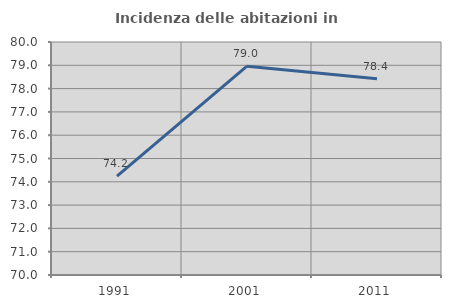
| Category | Incidenza delle abitazioni in proprietà  |
|---|---|
| 1991.0 | 74.242 |
| 2001.0 | 78.96 |
| 2011.0 | 78.422 |